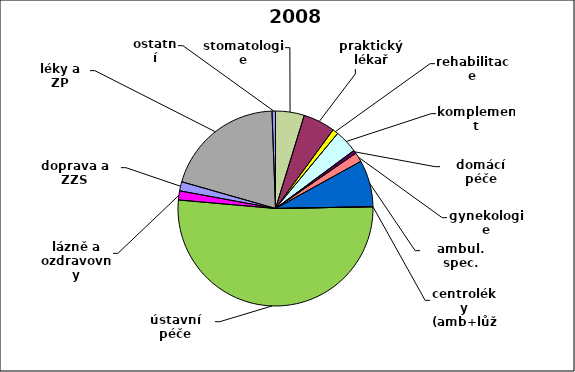
| Category | Series 0 |
|---|---|
| stomatologie | 0.048 |
| praktický lékař | 0.053 |
| rehabilitace | 0.009 |
| komplement | 0.038 |
| domácí péče | 0.006 |
| gynekologie | 0.016 |
| ambul. spec. | 0.077 |
| centroléky (amb+lůž) | 0 |
| ústavní péče | 0.517 |
| lázně a ozdravovny | 0.015 |
| doprava a ZZS | 0.015 |
| léky a ZP | 0.2 |
| ostatní | 0.006 |